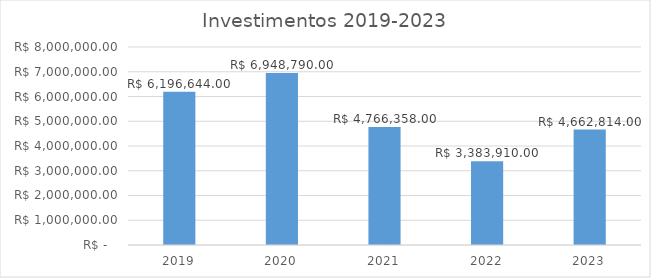
| Category | Investimentos 2019-2023 |
|---|---|
| 2019.0 | 6196644 |
| 2020.0 | 6948790 |
| 2021.0 | 4766358 |
| 2022.0 | 3383910 |
| 2023.0 | 4662814 |